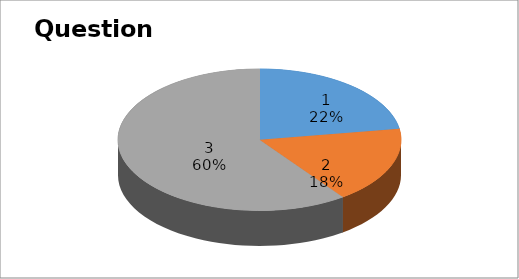
| Category | Series 0 |
|---|---|
| 0 | 9 |
| 1 | 7 |
| 2 | 24 |